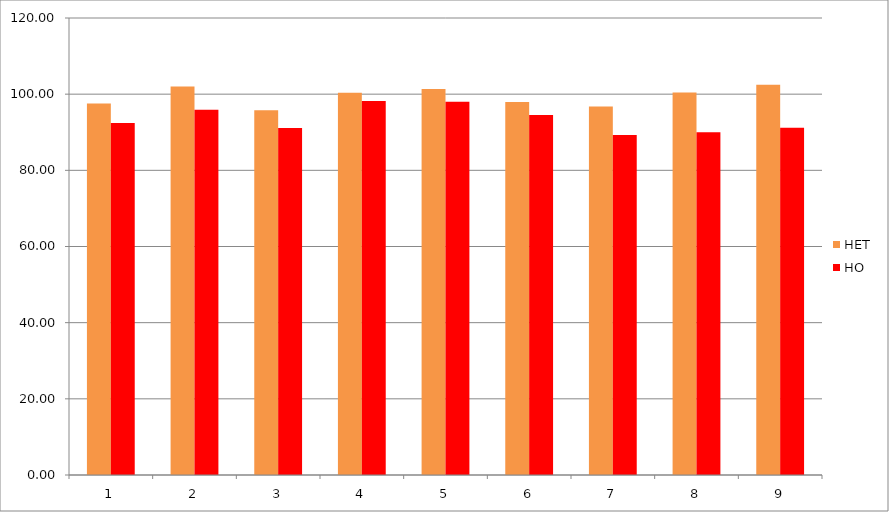
| Category | HET | HO |
|---|---|---|
| 0 | 97.556 | 92.437 |
| 1 | 102.003 | 95.934 |
| 2 | 95.799 | 91.145 |
| 3 | 100.369 | 98.185 |
| 4 | 101.368 | 97.984 |
| 5 | 97.928 | 94.504 |
| 6 | 96.765 | 89.252 |
| 7 | 100.422 | 90 |
| 8 | 102.504 | 91.204 |